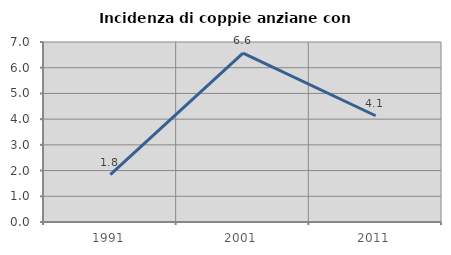
| Category | Incidenza di coppie anziane con figli |
|---|---|
| 1991.0 | 1.84 |
| 2001.0 | 6.569 |
| 2011.0 | 4.132 |